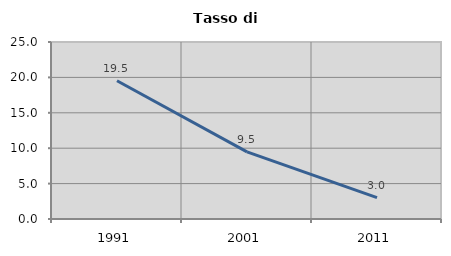
| Category | Tasso di disoccupazione   |
|---|---|
| 1991.0 | 19.531 |
| 2001.0 | 9.489 |
| 2011.0 | 3.012 |